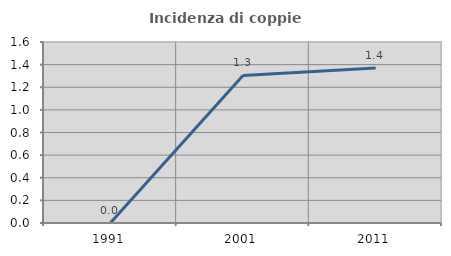
| Category | Incidenza di coppie miste |
|---|---|
| 1991.0 | 0 |
| 2001.0 | 1.304 |
| 2011.0 | 1.37 |